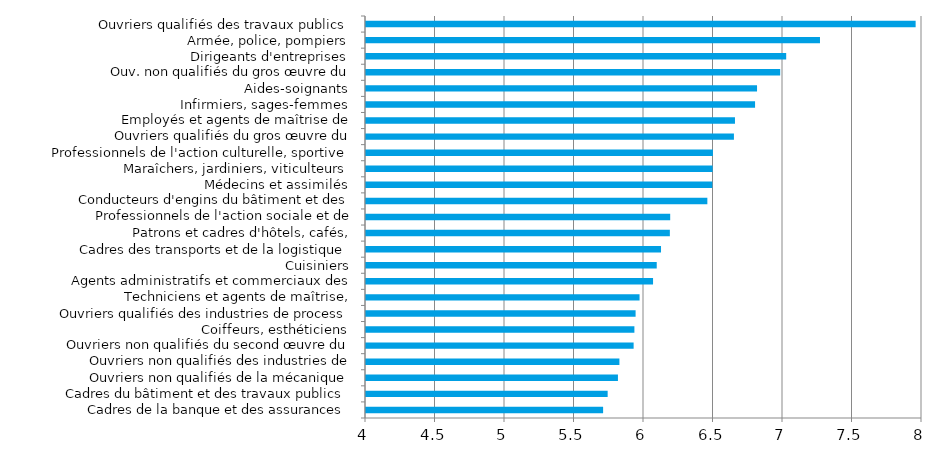
| Category | Series 0 |
|---|---|
| Cadres de la banque et des assurances | 5.706 |
| Cadres du bâtiment et des travaux publics | 5.739 |
| Ouvriers non qualifiés de la mécanique | 5.813 |
| Ouvriers non qualifiés des industries de process | 5.823 |
| Ouvriers non qualifiés du second œuvre du bâtiment | 5.925 |
| Coiffeurs, esthéticiens | 5.931 |
| Ouvriers qualifiés des industries de process | 5.94 |
| Techniciens et agents de maîtrise, électricité-électronique | 5.968 |
| Agents administratifs et commerciaux des transports | 6.065 |
| Cuisiniers | 6.092 |
| Cadres des transports et de la logistique | 6.122 |
| Patrons et cadres d'hôtels, cafés, restaurants | 6.186 |
| Professionnels de l'action sociale et de l'orientation | 6.188 |
| Conducteurs d'engins du bâtiment et des travaux publics | 6.456 |
| Médecins et assimilés | 6.491 |
| Maraîchers, jardiniers, viticulteurs | 6.494 |
| Professionnels de l'action culturelle, sportive | 6.496 |
| Ouvriers qualifiés du gros œuvre du bâtiment | 6.647 |
| Employés et agents de maîtrise de l'hôtellerie-restauration | 6.654 |
| Infirmiers, sages-femmes | 6.799 |
| Aides-soignants | 6.813 |
| Ouv. non qualifiés du gros œuvre du bâtiment et tr. pub. | 6.98 |
| Dirigeants d'entreprises | 7.023 |
| Armée, police, pompiers | 7.266 |
| Ouvriers qualifiés des travaux publics | 7.954 |